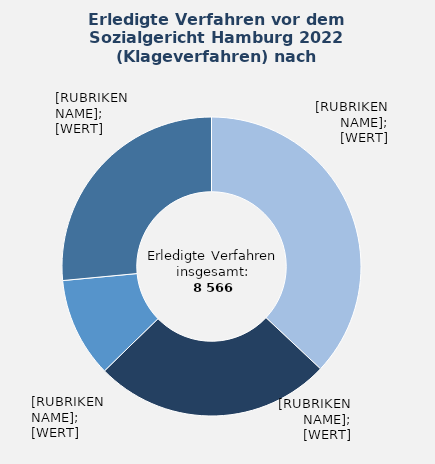
| Category | in Prozent |
|---|---|
| Krankenversicherung | 37 |
| Angelegenheiten nach dem SGB II | 25.7 |
| Rentenversicherung | 10.8 |
| Übrige Sachgebiete¹ | 26.5 |